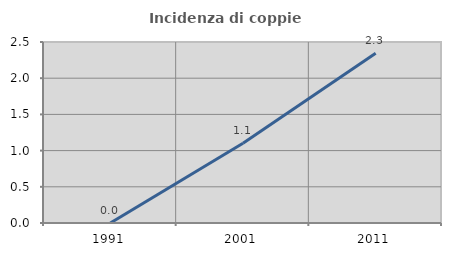
| Category | Incidenza di coppie miste |
|---|---|
| 1991.0 | 0 |
| 2001.0 | 1.101 |
| 2011.0 | 2.344 |